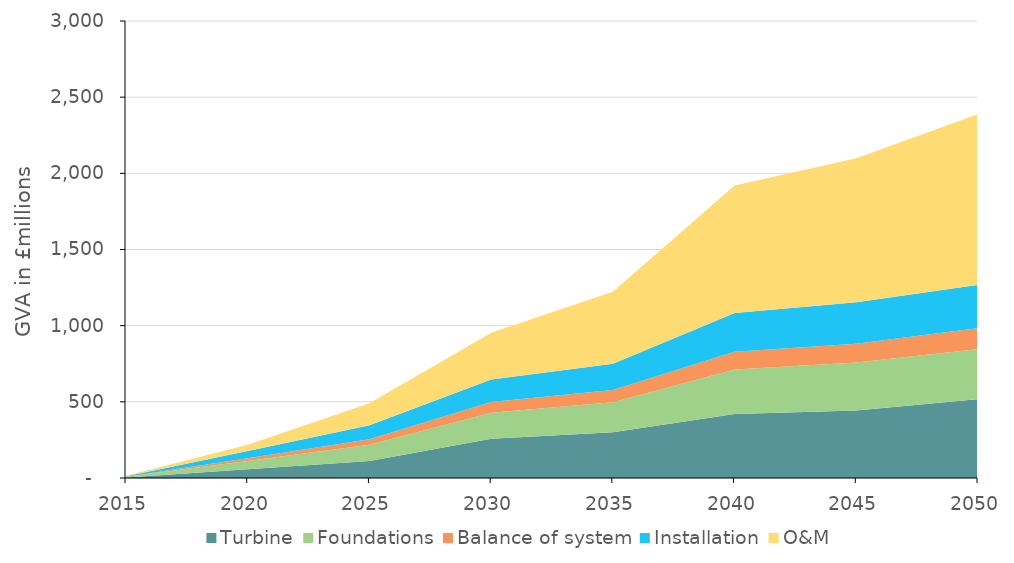
| Category | Turbine | Foundations | Balance of system | Installation | O&M  |
|---|---|---|---|---|---|
| 2015.0 | 3.698 | 3.707 | 1.304 | 3.216 | 2.188 |
| 2020.0 | 56.924 | 54.322 | 18.474 | 47.122 | 41.698 |
| 2025.0 | 112.285 | 105.408 | 36.857 | 91.436 | 145.27 |
| 2030.0 | 257.479 | 171.148 | 70.103 | 148.462 | 306.823 |
| 2035.0 | 299.973 | 197.064 | 81.233 | 170.943 | 473.172 |
| 2040.0 | 419.825 | 292.638 | 116.869 | 253.848 | 836.331 |
| 2045.0 | 443.587 | 313.917 | 124.374 | 272.307 | 944.098 |
| 2050.0 | 517.096 | 328.358 | 137.889 | 284.833 | 1119.609 |